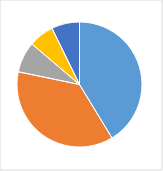
| Category | Series 0 |
|---|---|
| 0 | 0.413 |
| 1 | 0.37 |
| 2 | 0.08 |
| 3 | 0.065 |
| 4 | 0.072 |